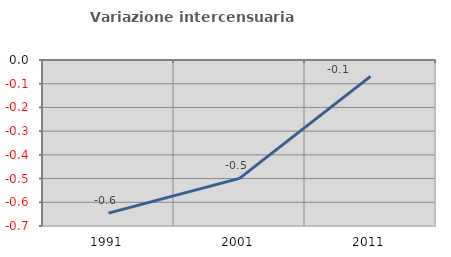
| Category | Variazione intercensuaria annua |
|---|---|
| 1991.0 | -0.646 |
| 2001.0 | -0.499 |
| 2011.0 | -0.069 |